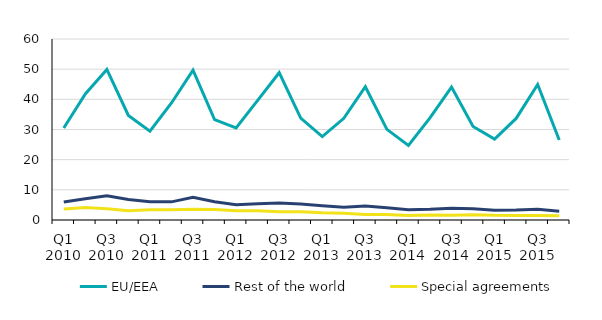
| Category | EU/EEA | Rest of the world | Special agreements |
|---|---|---|---|
| Q1 2010 | 30.508 | 5.951 | 3.611 |
| Q2 2010 | 41.764 | 7.028 | 4.125 |
| Q3 2010 | 49.907 | 8.028 | 3.718 |
| Q4 2010 | 34.666 | 6.797 | 3.031 |
| Q1 2011 | 29.452 | 6.02 | 3.42 |
| Q2 2011 | 38.792 | 6.01 | 3.424 |
| Q3 2011 | 49.654 | 7.503 | 3.53 |
| Q4 2011 | 33.3 | 6.034 | 3.452 |
| Q1 2012 | 30.526 | 5.093 | 3.073 |
| Q2 2012 | 39.654 | 5.384 | 3.058 |
| Q3 2012 | 48.827 | 5.662 | 2.697 |
| Q4 2012 | 33.799 | 5.329 | 2.717 |
| Q1 2013 | 27.65 | 4.721 | 2.378 |
| Q2 2013 | 33.711 | 4.208 | 2.245 |
| Q3 2013 | 44.187 | 4.659 | 1.822 |
| Q4 2013 | 30.051 | 4.056 | 1.796 |
| Q1 2014 | 24.693 | 3.419 | 1.529 |
| Q2 2014 | 33.838 | 3.536 | 1.646 |
| Q3 2014 | 44.076 | 3.854 | 1.569 |
| Q4 2014 | 31.02 | 3.743 | 1.768 |
| Q1 2015 | 26.84 | 3.245 | 1.561 |
| Q2 2015 | 33.673 | 3.292 | 1.522 |
| Q3 2015 | 44.932 | 3.601 | 1.485 |
| Q4 2015 | 26.527 | 2.913 | 1.443 |